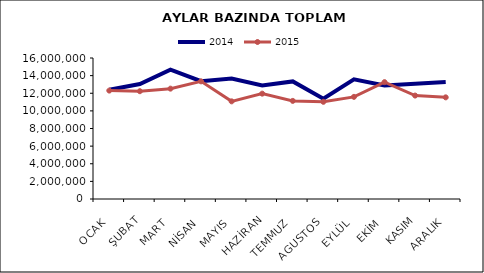
| Category | 2014 | 2015 |
|---|---|---|
| OCAK | 12399761.948 | 12302631.575 |
| ŞUBAT | 13053292.493 | 12232519.507 |
| MART | 14680110.78 | 12522480.849 |
| NİSAN | 13371185.664 | 13350958.114 |
| MAYIS | 13681906.159 | 11081341.402 |
| HAZİRAN | 12880924.246 | 11954606.7 |
| TEMMUZ | 13344776.958 | 11132949.566 |
| AGUSTOS | 11386828.925 | 11028296.474 |
| EYLÜL | 13583120.906 | 11590349.098 |
| EKİM | 12891630.102 | 13260718.15 |
| KASIM | 13067348.107 | 11737551.534 |
| ARALIK | 13269271.402 | 11535338.054 |